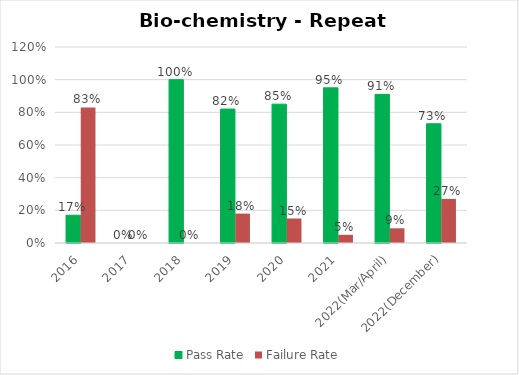
| Category | Pass Rate | Failure Rate |
|---|---|---|
| 2016 | 0.17 | 0.83 |
| 2017 | 0 | 0 |
| 2018 | 1 | 0 |
| 2019 | 0.82 | 0.18 |
| 2020 | 0.85 | 0.15 |
| 2021 | 0.95 | 0.05 |
| 2022(Mar/April) | 0.91 | 0.09 |
| 2022(December) | 0.73 | 0.27 |